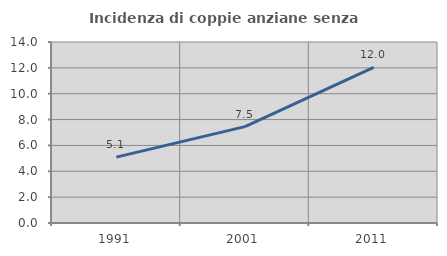
| Category | Incidenza di coppie anziane senza figli  |
|---|---|
| 1991.0 | 5.093 |
| 2001.0 | 7.456 |
| 2011.0 | 12.043 |